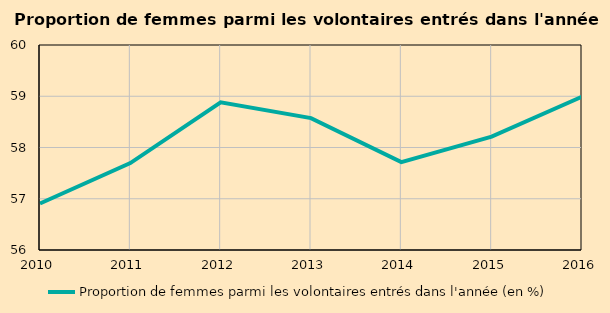
| Category | Proportion de femmes parmi les volontaires entrés dans l'année (en %) |
|---|---|
| 2010.0 | 56.907 |
| 2011.0 | 57.696 |
| 2012.0 | 58.88 |
| 2013.0 | 58.573 |
| 2014.0 | 57.715 |
| 2015.0 | 58.211 |
| 2016.0 | 58.991 |